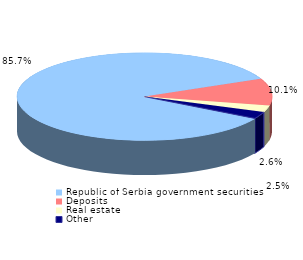
| Category | Series 0 |
|---|---|
| Republic of Serbia government securities | 0.857 |
| Deposits | 0.101 |
| Real estate | 0.025 |
| Other | 0.026 |